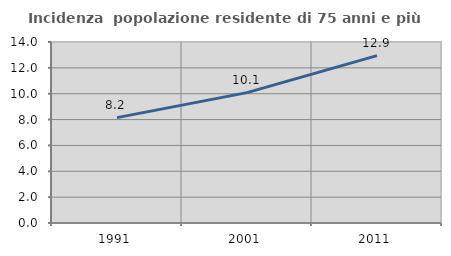
| Category | Incidenza  popolazione residente di 75 anni e più |
|---|---|
| 1991.0 | 8.152 |
| 2001.0 | 10.083 |
| 2011.0 | 12.943 |